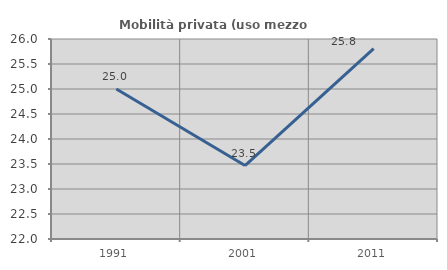
| Category | Mobilità privata (uso mezzo privato) |
|---|---|
| 1991.0 | 25 |
| 2001.0 | 23.469 |
| 2011.0 | 25.806 |